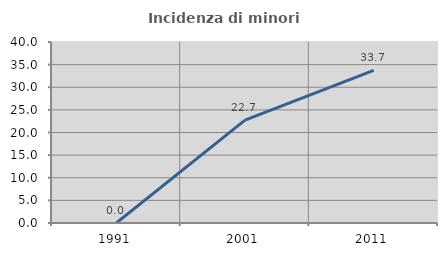
| Category | Incidenza di minori stranieri |
|---|---|
| 1991.0 | 0 |
| 2001.0 | 22.727 |
| 2011.0 | 33.721 |